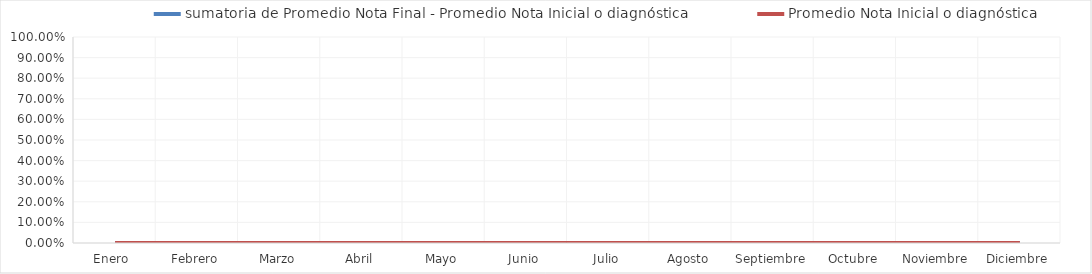
| Category | sumatoria de Promedio Nota Final - Promedio Nota Inicial o diagnóstica | Promedio Nota Inicial o diagnóstica |
|---|---|---|
| Enero  | 0 | 0 |
| Febrero | 0 | 0 |
| Marzo | 0 | 0 |
| Abril | 0 | 0 |
| Mayo | 0 | 0 |
| Junio | 0 | 0 |
| Julio | 0 | 0 |
| Agosto | 0 | 0 |
| Septiembre | 0 | 0 |
| Octubre | 0 | 0 |
| Noviembre | 0 | 0 |
| Diciembre | 0 | 0 |